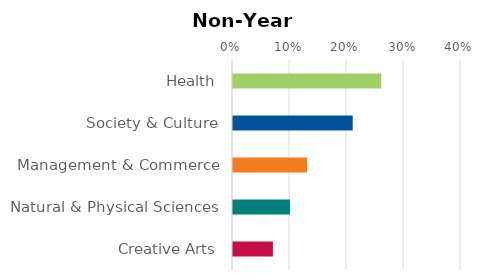
| Category | Series 0 |
|---|---|
| Health | 0.26 |
| Society & Culture | 0.21 |
| Management & Commerce | 0.13 |
| Natural & Physical Sciences | 0.1 |
| Creative Arts | 0.07 |